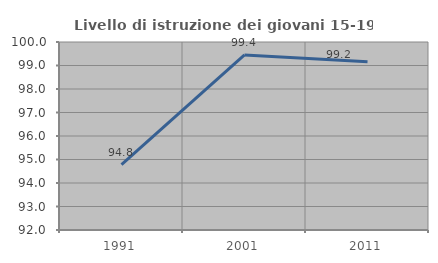
| Category | Livello di istruzione dei giovani 15-19 anni |
|---|---|
| 1991.0 | 94.783 |
| 2001.0 | 99.448 |
| 2011.0 | 99.16 |